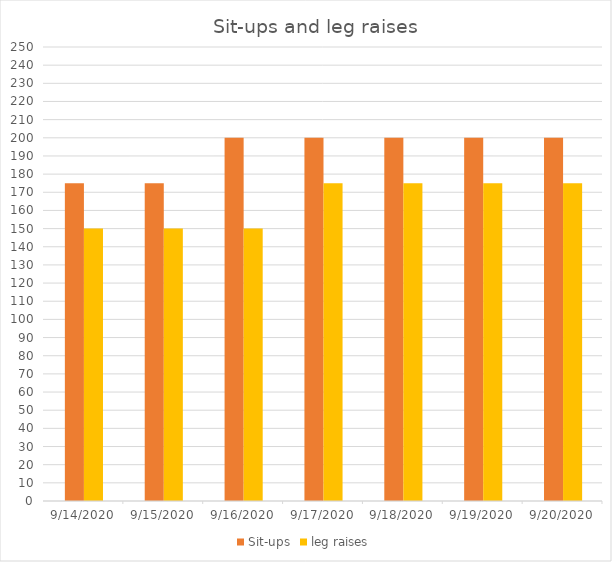
| Category | Sit-ups | leg raises |
|---|---|---|
| 9/14/20 | 175 | 150 |
| 9/15/20 | 175 | 150 |
| 9/16/20 | 200 | 150 |
| 9/17/20 | 200 | 175 |
| 9/18/20 | 200 | 175 |
| 9/19/20 | 200 | 175 |
| 9/20/20 | 200 | 175 |